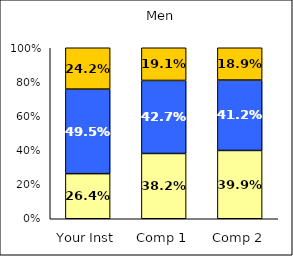
| Category | Low Satisfaction with Courses | Average Satisfaction with Courses | High Satisfaction with Courses |
|---|---|---|---|
| Your Inst | 0.264 | 0.495 | 0.242 |
| Comp 1 | 0.382 | 0.427 | 0.191 |
| Comp 2 | 0.399 | 0.412 | 0.189 |